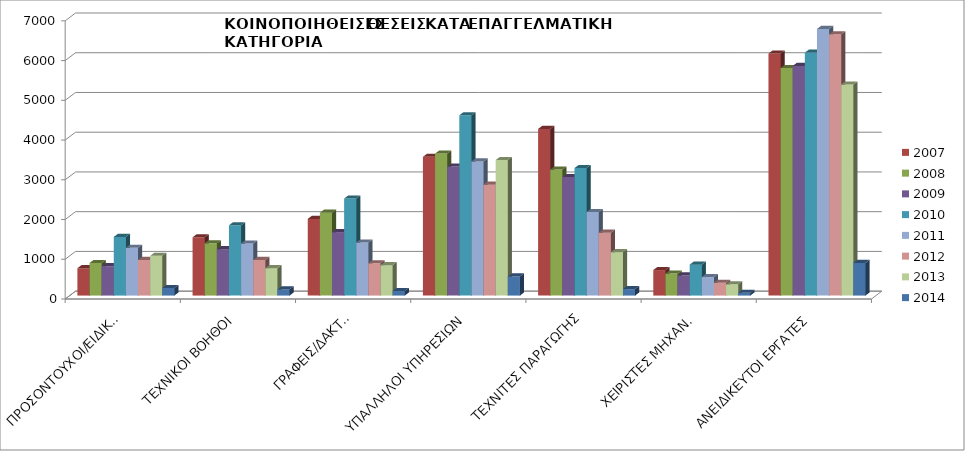
| Category | 2007 | 2008 | 2009 | 2010 | 2011 | 2012 | 2013 | 2014 |
|---|---|---|---|---|---|---|---|---|
| ΠΡΟΣΟΝΤΟΥΧΟΙ/ΕΙΔΙΚΟΙ | 688 | 819 | 741 | 1476 | 1201 | 896 | 999 | 190 |
| ΤΕΧΝΙΚΟΙ ΒΟΗΘΟΙ | 1467 | 1315 | 1167 | 1769 | 1310 | 895 | 690 | 154 |
| ΓΡΑΦΕΙΣ/ΔΑΚΤ.Ι | 1929 | 2084 | 1596 | 2442 | 1335 | 812 | 765 | 114 |
| ΥΠΑΛΛΗΛΟΙ ΥΠΗΡΕΣΙΩΝ | 3492 | 3573 | 3246 | 4536 | 3374 | 2791 | 3410 | 480 |
| ΤΕΧΝΙΤΕΣ ΠΑΡΑΓΩΓΗΣ | 4193 | 3170 | 2981 | 3208 | 2101 | 1582 | 1092 | 163 |
| ΧΕΙΡΙΣΤΕΣ ΜΗΧΑΝ. | 642 | 553 | 505 | 778 | 466 | 321 | 284 | 70 |
| ΑΝΕΙΔΙΚΕΥΤΟΙ ΕΡΓΑΤΕΣ | 6090 | 5726 | 5780 | 6114 | 6709 | 6575 | 5311 | 822 |